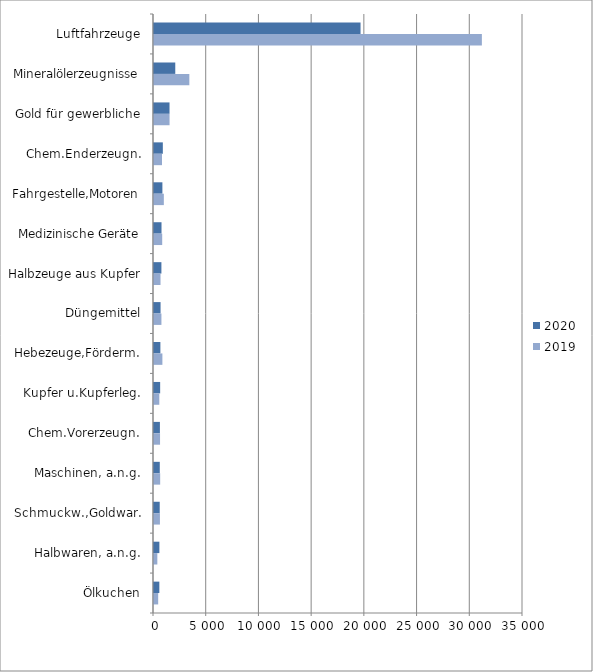
| Category | 2020 | 2019 |
|---|---|---|
| Luftfahrzeuge | 19591.386 | 31098.814 |
| Mineralölerzeugnisse | 2017.175 | 3352.136 |
| Gold für gewerbliche | 1472.567 | 1475.916 |
| Chem.Enderzeugn. | 837.93 | 760.072 |
| Fahrgestelle,Motoren | 796.18 | 933.096 |
| Medizinische Geräte | 712.658 | 778.034 |
| Halbzeuge aus Kupfer | 702.86 | 618.369 |
| Düngemittel | 622.914 | 704.316 |
| Hebezeuge,Förderm. | 606.098 | 796.453 |
| Kupfer u.Kupferleg. | 583.765 | 503.304 |
| Chem.Vorerzeugn. | 560.539 | 573.553 |
| Maschinen, a.n.g. | 548.572 | 585.246 |
| Schmuckw.,Goldwar. | 541.999 | 562.269 |
| Halbwaren, a.n.g. | 510.589 | 315.807 |
| Ölkuchen | 506.325 | 396.75 |